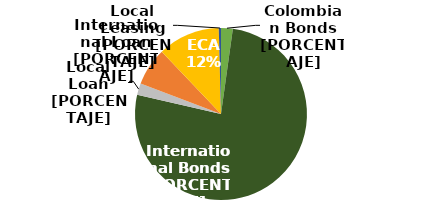
| Category | Series 0 |
|---|---|
| Bonos Locales | 0.022 |
| Bonos Intl. | 0.764 |
| Crédito Local | 0.022 |
| Crédito Intl. | 0.072 |
| ECA | 0.117 |
| Leasing Local | 0.004 |